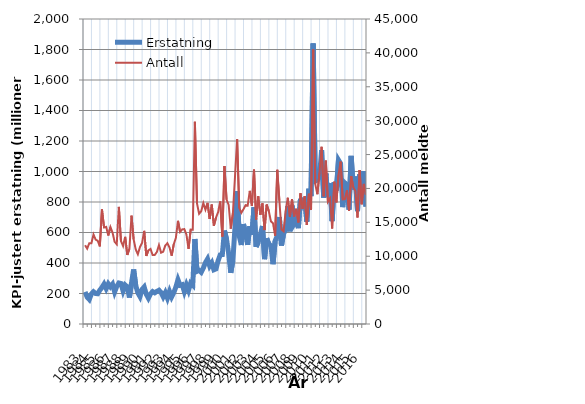
| Category | Erstatning |
|---|---|
| 1983.0 | 210.22 |
| nan | 176.092 |
| nan | 161.035 |
| nan | 197.262 |
| 1984.0 | 211.53 |
| nan | 200.092 |
| nan | 198.387 |
| nan | 221.897 |
| 1985.0 | 239.789 |
| nan | 262.097 |
| nan | 232.248 |
| nan | 263.401 |
| 1986.0 | 244.213 |
| nan | 261.318 |
| nan | 210.326 |
| nan | 246.13 |
| 1987.0 | 268.892 |
| nan | 265.347 |
| nan | 217.144 |
| nan | 255.477 |
| 1988.0 | 243.163 |
| nan | 173.337 |
| nan | 269.977 |
| nan | 357.645 |
| 1989.0 | 252.668 |
| nan | 204.216 |
| nan | 179.693 |
| nan | 226.703 |
| 1990.0 | 242.739 |
| nan | 195.284 |
| nan | 169.363 |
| nan | 197.133 |
| 1991.0 | 212.725 |
| nan | 204.534 |
| nan | 214.059 |
| nan | 221.31 |
| 1992.0 | 206.744 |
| nan | 178.142 |
| nan | 205.839 |
| nan | 169.858 |
| 1993.0 | 213.125 |
| nan | 177.367 |
| nan | 204.917 |
| nan | 242.422 |
| 1994.0 | 290.354 |
| nan | 253.835 |
| nan | 257.894 |
| nan | 212.568 |
| 1995.0 | 256.1 |
| nan | 220.322 |
| nan | 267.715 |
| nan | 254.182 |
| 1996.0 | 557.419 |
| nan | 345.163 |
| nan | 351.33 |
| nan | 338.83 |
| 1997.0 | 366.813 |
| nan | 402.515 |
| nan | 426.268 |
| nan | 380.33 |
| 1998.0 | 401.239 |
| nan | 355.459 |
| nan | 361.267 |
| nan | 415.235 |
| 1999.0 | 452.902 |
| nan | 455.102 |
| nan | 612.398 |
| nan | 554.608 |
| 2000.0 | 462.302 |
| nan | 335.733 |
| nan | 416.214 |
| nan | 634.598 |
| 2001.0 | 870.913 |
| nan | 576.547 |
| nan | 517.816 |
| nan | 655.144 |
| 2002.0 | 596.676 |
| nan | 519.166 |
| nan | 641.6 |
| nan | 584.641 |
| 2003.0 | 764.63 |
| nan | 505.546 |
| nan | 537.836 |
| nan | 585.894 |
| 2004.0 | 642.757 |
| nan | 424.948 |
| nan | 561.798 |
| nan | 525.108 |
| 2005.0 | 513.953 |
| nan | 392.217 |
| nan | 544.503 |
| nan | 577.037 |
| 2006.0 | 701.398 |
| nan | 514.379 |
| nan | 591.856 |
| nan | 617.47 |
| 2007.0 | 772.886 |
| nan | 607.651 |
| nan | 776.377 |
| nan | 656.412 |
| 2008.0 | 678.816 |
| nan | 628.412 |
| nan | 820.743 |
| nan | 788.239 |
| 2009.0 | 827.169 |
| nan | 671.529 |
| nan | 887.072 |
| nan | 838.469 |
| 2010.0 | 1839.261 |
| nan | 938.114 |
| nan | 942.627 |
| nan | 964.348 |
| 2011.0 | 1139.682 |
| nan | 828.751 |
| nan | 988.158 |
| nan | 832.784 |
| 2012.0 | 922.611 |
| nan | 674.513 |
| nan | 929.964 |
| nan | 875.649 |
| 2013.0 | 1075.389 |
| nan | 1053.009 |
| nan | 766.218 |
| nan | 925.502 |
| 2014.0 | 912.794 |
| nan | 749.584 |
| nan | 1102.677 |
| nan | 881.657 |
| 2015.0 | 967.292 |
| nan | 740.776 |
| nan | 980.576 |
| nan | 870.639 |
| 2016.0 | 1000.868 |
| nan | 770.405 |